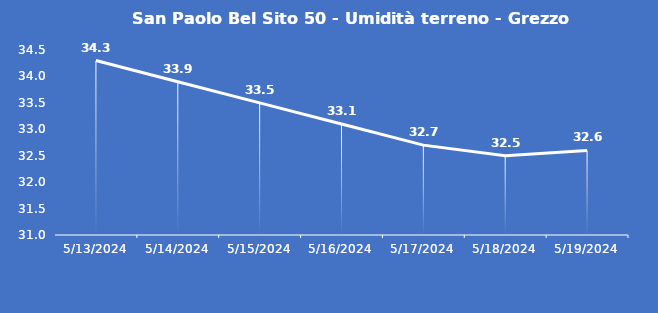
| Category | San Paolo Bel Sito 50 - Umidità terreno - Grezzo (%VWC) |
|---|---|
| 5/13/24 | 34.3 |
| 5/14/24 | 33.9 |
| 5/15/24 | 33.5 |
| 5/16/24 | 33.1 |
| 5/17/24 | 32.7 |
| 5/18/24 | 32.5 |
| 5/19/24 | 32.6 |